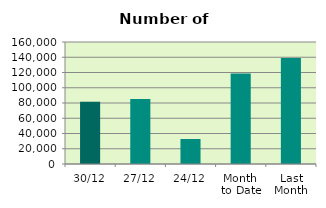
| Category | Series 0 |
|---|---|
| 30/12 | 81700 |
| 27/12 | 85324 |
| 24/12 | 32790 |
| Month 
to Date | 118625.684 |
| Last
Month | 138953.619 |